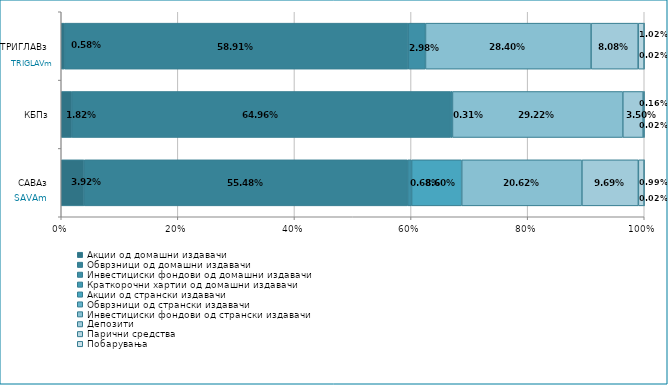
| Category | Акции од домашни издавачи  | Обврзници од домашни издавачи  | Инвестициски фондови од домашни издавачи  | Краткорочни хартии од домашни издавачи  | Акции од странски издавачи  | Обврзници од странски издавачи  | Инвестициски фондови од странски издавaчи | Депозити  | Парични средства  | Побарувања |
|---|---|---|---|---|---|---|---|---|---|---|
| САВАз | 0.039 | 0.555 | 0.007 | 0 | 0.086 | 0 | 0.206 | 0.097 | 0.01 | 0 |
| КБПз | 0.018 | 0.65 | 0.003 | 0 | 0 | 0 | 0.292 | 0.035 | 0.002 | 0 |
| ТРИГЛАВз | 0.006 | 0.589 | 0.03 | 0 | 0 | 0 | 0.284 | 0.081 | 0.01 | 0 |